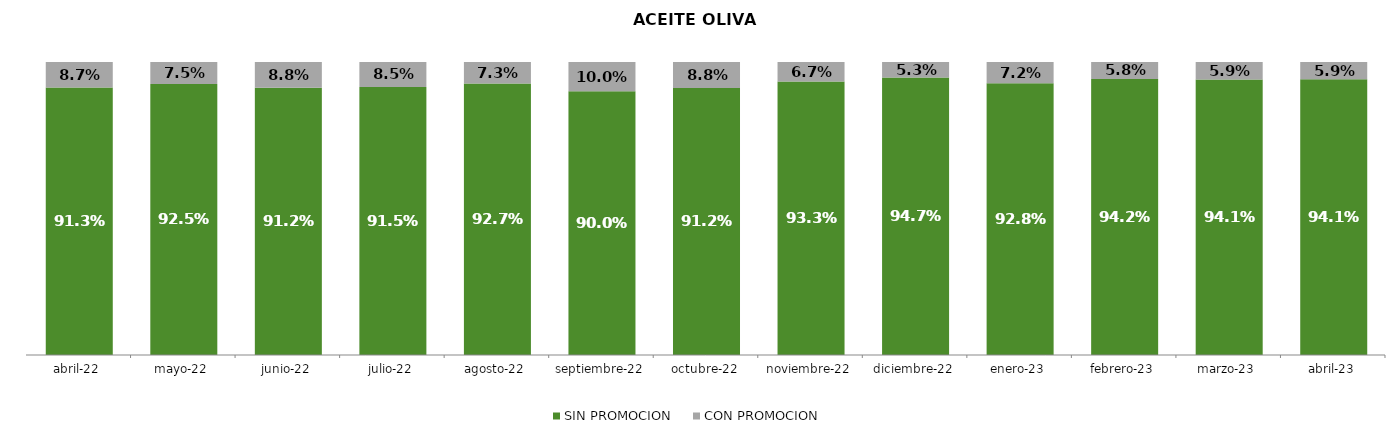
| Category | SIN PROMOCION   | CON PROMOCION   |
|---|---|---|
| 2022-04-01 | 0.913 | 0.087 |
| 2022-05-01 | 0.925 | 0.075 |
| 2022-06-01 | 0.912 | 0.088 |
| 2022-07-01 | 0.915 | 0.085 |
| 2022-08-01 | 0.927 | 0.073 |
| 2022-09-01 | 0.9 | 0.1 |
| 2022-10-01 | 0.912 | 0.088 |
| 2022-11-01 | 0.933 | 0.067 |
| 2022-12-01 | 0.947 | 0.053 |
| 2023-01-01 | 0.928 | 0.072 |
| 2023-02-01 | 0.942 | 0.058 |
| 2023-03-01 | 0.941 | 0.059 |
| 2023-04-01 | 0.941 | 0.059 |